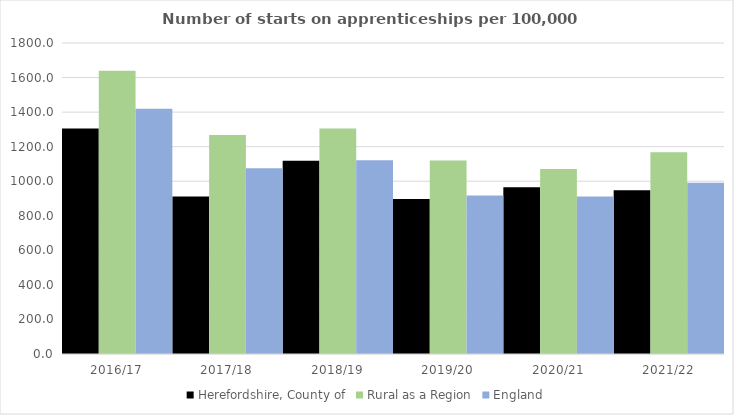
| Category | Herefordshire, County of | Rural as a Region | England |
|---|---|---|---|
| 2016/17 | 1305 | 1638.789 | 1420 |
| 2017/18 | 912 | 1267.474 | 1075 |
| 2018/19 | 1119 | 1304.57 | 1122 |
| 2019/20 | 897 | 1119.662 | 918 |
| 2020/21 | 965 | 1070.748 | 912 |
| 2021/22 | 948 | 1167.68 | 991 |